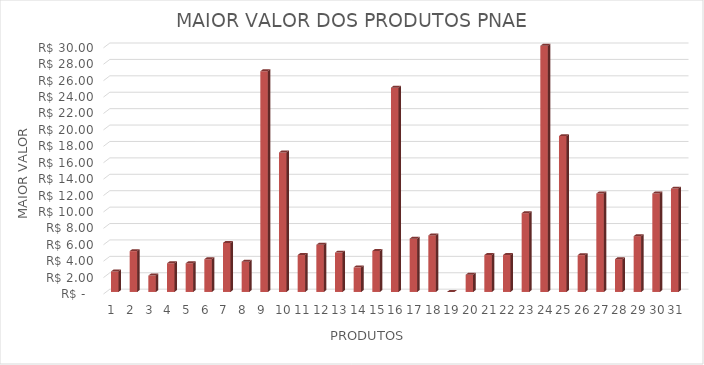
| Category | Series 0 |
|---|---|
| 0 | 2.5 |
| 1 | 4.98 |
| 2 | 2 |
| 3 | 3.5 |
| 4 | 3.5 |
| 5 | 3.99 |
| 6 | 5.98 |
| 7 | 3.69 |
| 8 | 26.9 |
| 9 | 17 |
| 10 | 4.5 |
| 11 | 5.75 |
| 12 | 4.8 |
| 13 | 3 |
| 14 | 5 |
| 15 | 24.9 |
| 16 | 6.5 |
| 17 | 6.89 |
| 18 | 0 |
| 19 | 2.1 |
| 20 | 4.5 |
| 21 | 4.5 |
| 22 | 9.6 |
| 23 | 31.25 |
| 24 | 19 |
| 25 | 4.49 |
| 26 | 12 |
| 27 | 4 |
| 28 | 6.8 |
| 29 | 12 |
| 30 | 12.6 |